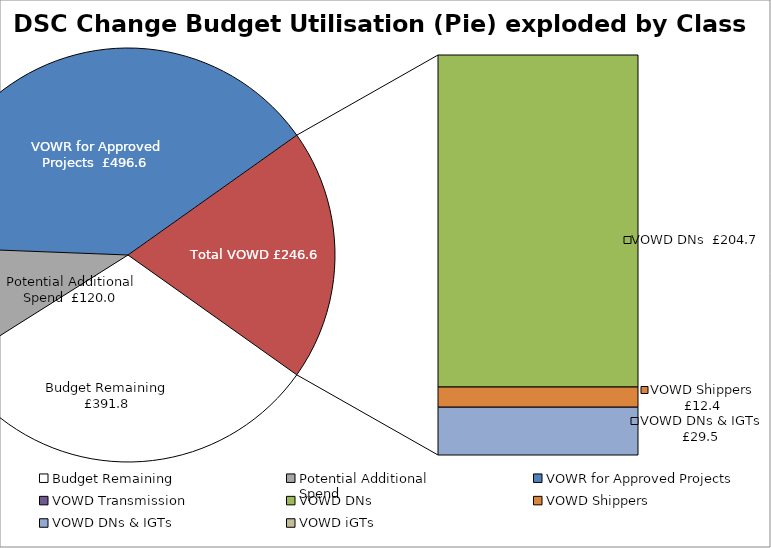
| Category | Series 0 |
|---|---|
| Budget Remaining | 391.838 |
| Potential Additional 
Spend | 120 |
| VOWR for Approved Projects | 496.555 |
| VOWD Transmission | 0 |
| VOWD DNs | 204.744 |
| VOWD Shippers | 12.424 |
| VOWD DNs & IGTs | 29.48 |
| VOWD iGTs | 0 |